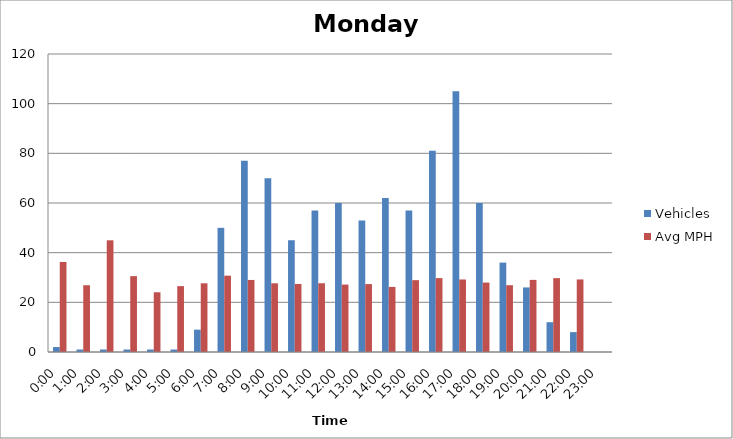
| Category | Vehicles | Avg MPH |
|---|---|---|
| 0:00 | 2 | 36.26 |
| 1:00 | 1 | 26.89 |
| 2:00 | 1 | 44.98 |
| 3:00 | 1 | 30.55 |
| 4:00 | 1 | 24.05 |
| 5:00 | 1 | 26.52 |
| 6:00 | 9 | 27.67 |
| 7:00 | 50 | 30.74 |
| 8:00 | 77 | 29.01 |
| 9:00 | 70 | 27.66 |
| 10:00 | 45 | 27.41 |
| 11:00 | 57 | 27.69 |
| 12:00 | 60 | 27.14 |
| 13:00 | 53 | 27.35 |
| 14:00 | 62 | 26.2 |
| 15:00 | 57 | 28.93 |
| 16:00 | 81 | 29.76 |
| 17:00 | 105 | 29.2 |
| 18:00 | 60 | 27.96 |
| 19:00 | 36 | 26.9 |
| 20:00 | 26 | 29.04 |
| 21:00 | 12 | 29.75 |
| 22:00 | 8 | 29.22 |
| 23:00 | 0 | 0 |